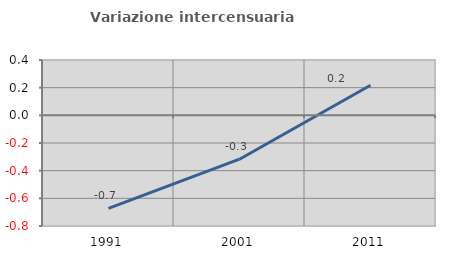
| Category | Variazione intercensuaria annua |
|---|---|
| 1991.0 | -0.672 |
| 2001.0 | -0.317 |
| 2011.0 | 0.217 |